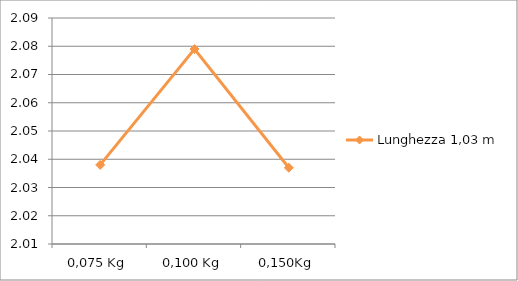
| Category | Lunghezza 1,03 m |
|---|---|
| 0,075 Kg | 2.038 |
| 0,100 Kg | 2.079 |
| 0,150Kg | 2.037 |